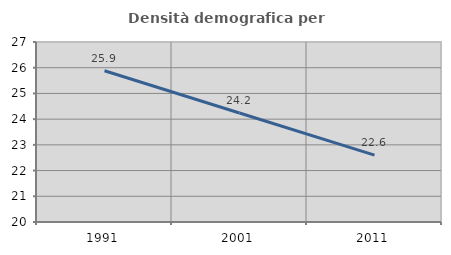
| Category | Densità demografica |
|---|---|
| 1991.0 | 25.884 |
| 2001.0 | 24.237 |
| 2011.0 | 22.6 |